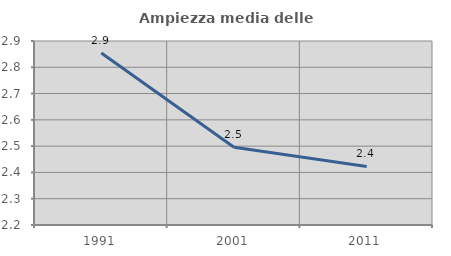
| Category | Ampiezza media delle famiglie |
|---|---|
| 1991.0 | 2.855 |
| 2001.0 | 2.496 |
| 2011.0 | 2.423 |